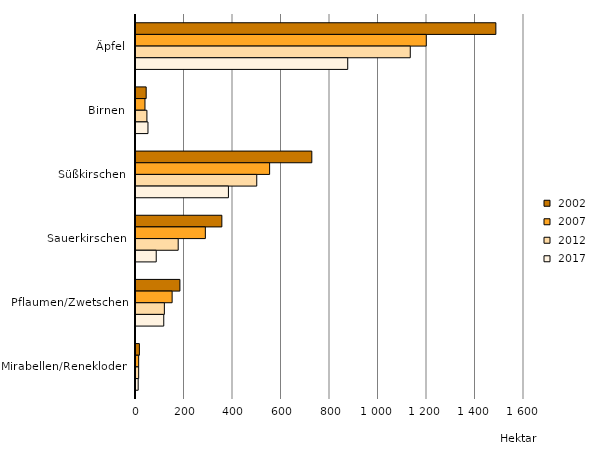
| Category |  2002 |  2007 |  2012 |  2017 |
|---|---|---|---|---|
| Äpfel | 1484 | 1197 | 1131 | 873.12 |
| Birnen | 42 | 37 | 45 | 49.41 |
| Süßkirschen | 725 | 551 | 498 | 381.16 |
| Sauerkirschen | 354 | 286 | 174 | 83.39 |
| Pflaumen/Zwetschen | 181 | 149 | 117 | 114.44 |
| Mirabellen/Renekloden | 14 | 11 | 11 | 9.01 |